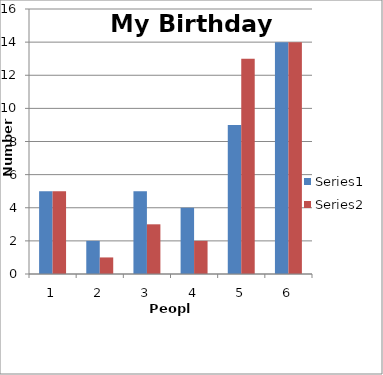
| Category | Series 0 | Series 1 |
|---|---|---|
| 0 | 5 | 5 |
| 1 | 2 | 1 |
| 2 | 5 | 3 |
| 3 | 4 | 2 |
| 4 | 9 | 13 |
| 5 | 14 | 14 |